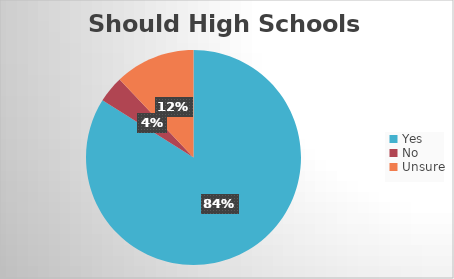
| Category | Series 0 |
|---|---|
| Yes | 167 |
| No | 8 |
| Unsure | 24 |